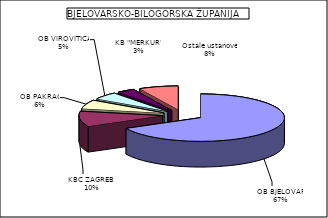
| Category | Series 0 |
|---|---|
| OB BJELOVAR | 67.499 |
| KBC ZAGREB  | 10.498 |
| OB PAKRAC | 5.996 |
| OB VIROVITICA | 4.999 |
| KB "MERKUR" | 3.419 |
| Ostale ustanove | 7.588 |